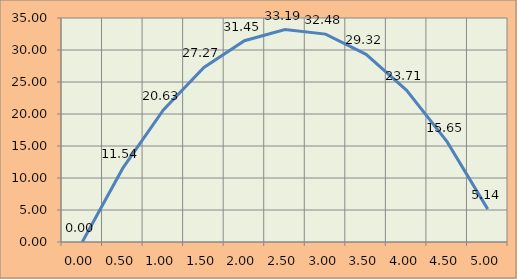
| Category | Series 0 |
|---|---|
| 0.0 | 0 |
| 0.5 | 11.539 |
| 1.0 | 20.627 |
| 1.5 | 27.266 |
| 2.0 | 31.454 |
| 2.5 | 33.193 |
| 3.0 | 32.481 |
| 3.5 | 29.32 |
| 4.0 | 23.708 |
| 4.5 | 15.647 |
| 5.0 | 5.136 |